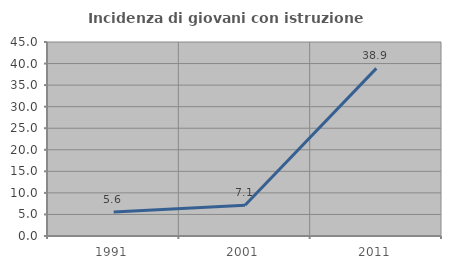
| Category | Incidenza di giovani con istruzione universitaria |
|---|---|
| 1991.0 | 5.556 |
| 2001.0 | 7.143 |
| 2011.0 | 38.889 |